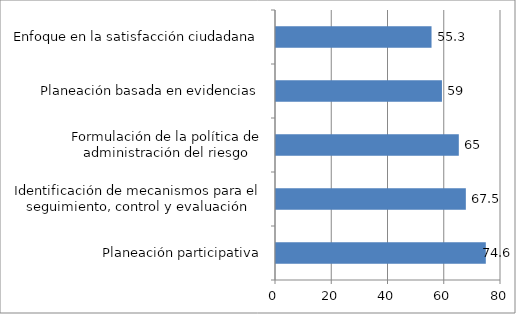
| Category | CALIFICACION |
|---|---|
| Planeación participativa | 74.6 |
| Identificación de mecanismos para el seguimiento, control y evaluación | 67.5 |
| Formulación de la política de administración del riesgo | 65 |
| Planeación basada en evidencias | 59 |
| Enfoque en la satisfacción ciudadana | 55.3 |